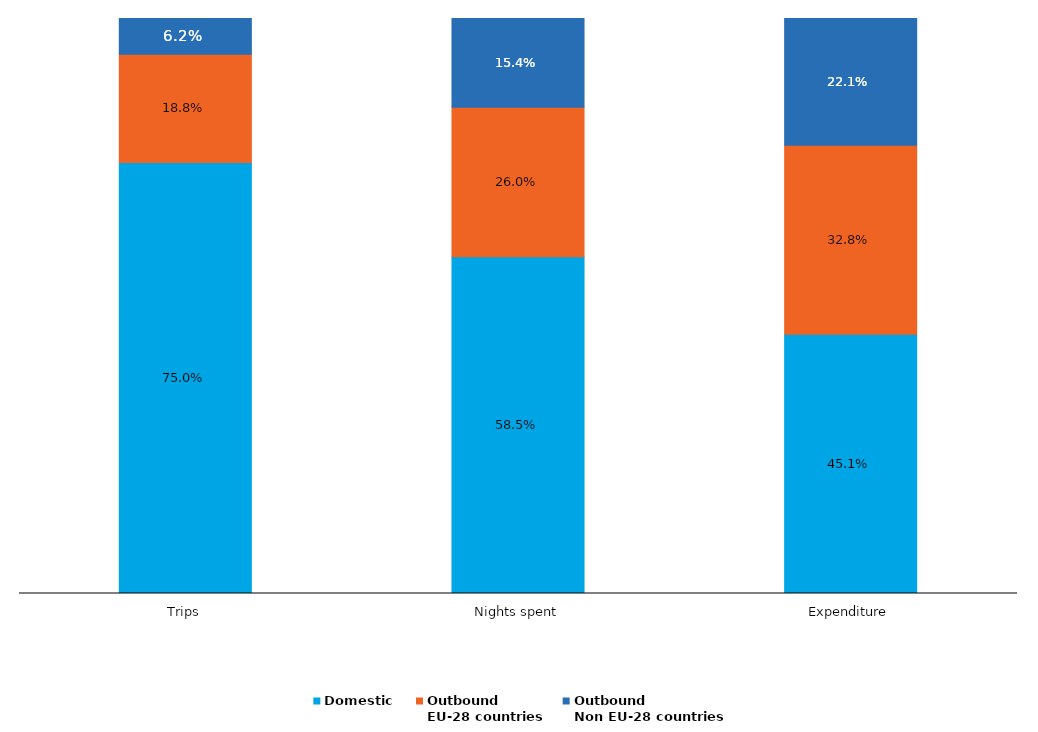
| Category | Domestic | Outbound 
EU-28 countries | Outbound 
Non EU-28 countries |
|---|---|---|---|
| Trips | 0.75 | 0.188 | 0.062 |
| Nights spent | 0.585 | 0.26 | 0.154 |
| Expenditure | 0.451 | 0.328 | 0.221 |